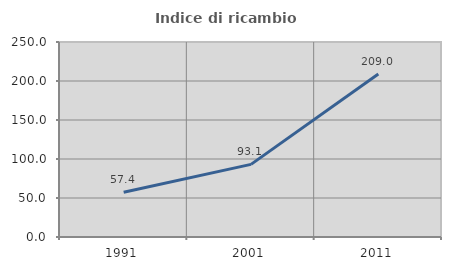
| Category | Indice di ricambio occupazionale  |
|---|---|
| 1991.0 | 57.35 |
| 2001.0 | 93.135 |
| 2011.0 | 209.012 |